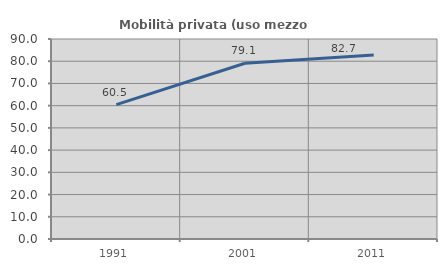
| Category | Mobilità privata (uso mezzo privato) |
|---|---|
| 1991.0 | 60.456 |
| 2001.0 | 79.11 |
| 2011.0 | 82.749 |